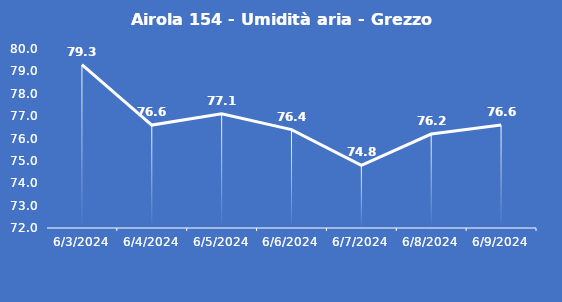
| Category | Airola 154 - Umidità aria - Grezzo (%) |
|---|---|
| 6/3/24 | 79.3 |
| 6/4/24 | 76.6 |
| 6/5/24 | 77.1 |
| 6/6/24 | 76.4 |
| 6/7/24 | 74.8 |
| 6/8/24 | 76.2 |
| 6/9/24 | 76.6 |